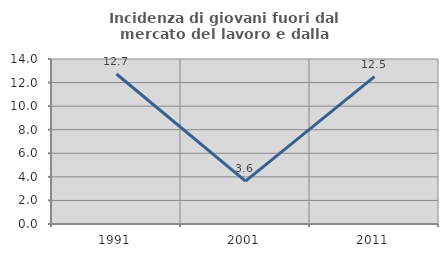
| Category | Incidenza di giovani fuori dal mercato del lavoro e dalla formazione  |
|---|---|
| 1991.0 | 12.727 |
| 2001.0 | 3.636 |
| 2011.0 | 12.5 |